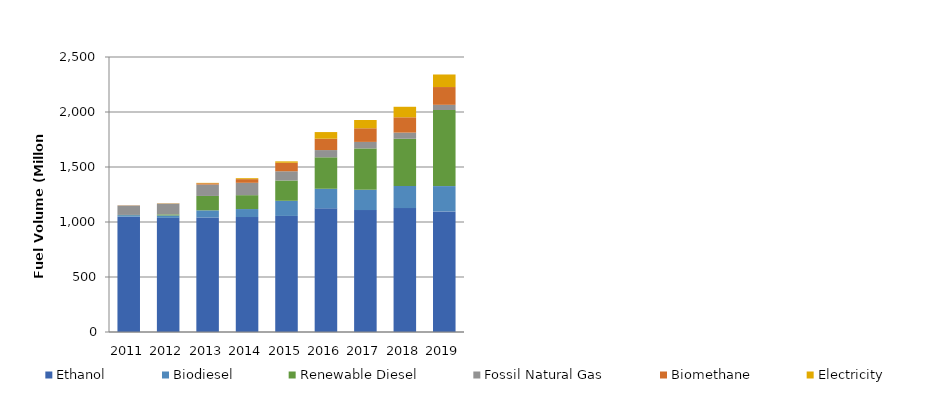
| Category | Ethanol | Biodiesel | Renewable Diesel | Fossil Natural Gas | Biomethane | Electricity |
|---|---|---|---|---|---|---|
| 2011.0 | 1048.627 | 13.652 | 2.019 | 85.217 | 1.829 | 0.375 |
| 2012.0 | 1037.61 | 21.752 | 9.867 | 98.172 | 1.85 | 1.315 |
| 2013.0 | 1040.693 | 65.228 | 130.891 | 103.459 | 11.884 | 3.6 |
| 2014.0 | 1044.897 | 72.738 | 126.309 | 112.372 | 33.367 | 8.453 |
| 2015.0 | 1055.011 | 137.695 | 184.861 | 83.675 | 77.055 | 12.976 |
| 2016.0 | 1124.219 | 177.874 | 286.176 | 65.601 | 103.476 | 60.214 |
| 2017.0 | 1108.304 | 185.123 | 375.49 | 59.258 | 123.968 | 75.181 |
| 2018.0 | 1126.553 | 200.889 | 429.33 | 55.915 | 139.179 | 95.647 |
| 2019.0 | 1095.948 | 230.465 | 691.612 | 47.182 | 161.7 | 114.125 |